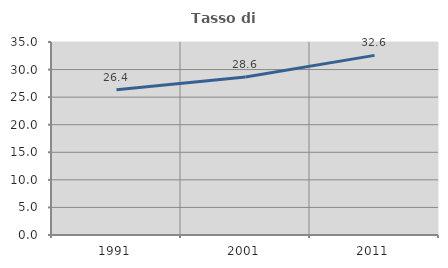
| Category | Tasso di occupazione   |
|---|---|
| 1991.0 | 26.36 |
| 2001.0 | 28.64 |
| 2011.0 | 32.576 |